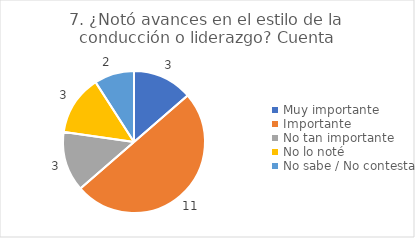
| Category | 7. ¿Notó avances en el estilo de la conducción o liderazgo? |
|---|---|
| Muy importante  | 0.136 |
| Importante  | 0.5 |
| No tan importante  | 0.136 |
| No lo noté  | 0.136 |
| No sabe / No contesta | 0.091 |